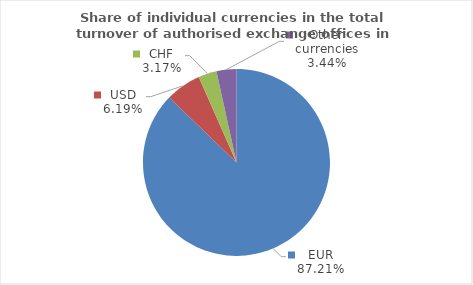
| Category | Series 0 |
|---|---|
| EUR | 87.206 |
| USD | 6.185 |
| CHF | 3.165 |
| Other currencies | 3.444 |